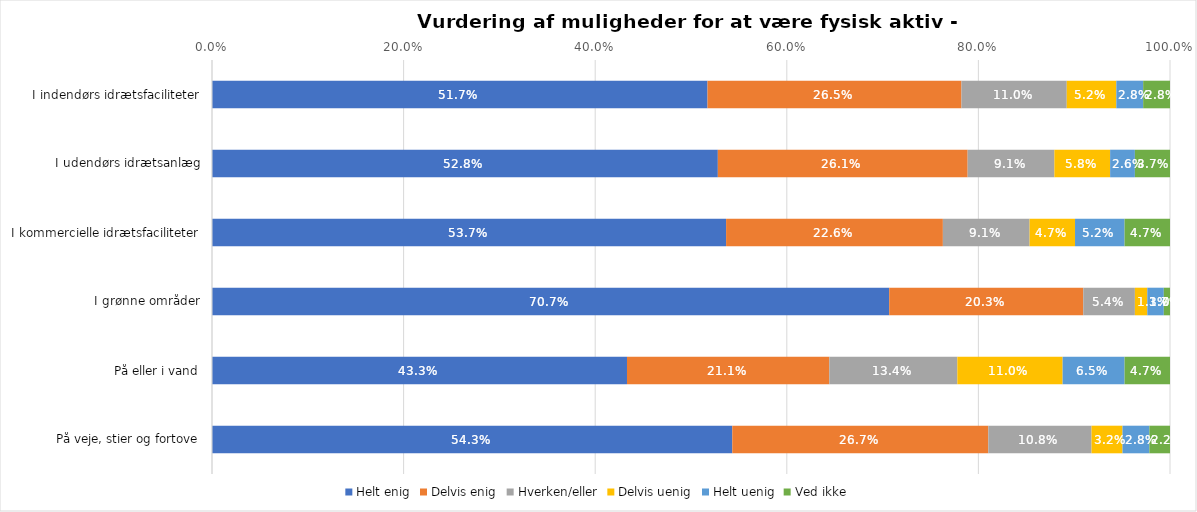
| Category | Helt enig | Delvis enig | Hverken/eller | Delvis uenig | Helt uenig | Ved ikke |
|---|---|---|---|---|---|---|
| I indendørs idrætsfaciliteter | 0.517 | 0.265 | 0.11 | 0.052 | 0.028 | 0.028 |
| I udendørs idrætsanlæg | 0.528 | 0.261 | 0.091 | 0.058 | 0.026 | 0.037 |
| I kommercielle idrætsfaciliteter | 0.537 | 0.226 | 0.091 | 0.047 | 0.052 | 0.047 |
| I grønne områder | 0.707 | 0.203 | 0.054 | 0.013 | 0.017 | 0.006 |
| På eller i vand | 0.433 | 0.211 | 0.134 | 0.11 | 0.065 | 0.047 |
| På veje, stier og fortove | 0.543 | 0.267 | 0.108 | 0.032 | 0.028 | 0.022 |